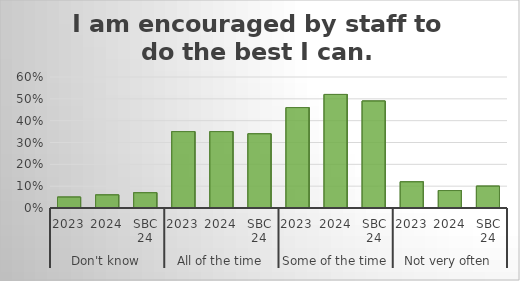
| Category | I am encouraged by staff to do the best I can. |
|---|---|
| 0 | 0.05 |
| 1 | 0.06 |
| 2 | 0.07 |
| 3 | 0.35 |
| 4 | 0.35 |
| 5 | 0.34 |
| 6 | 0.46 |
| 7 | 0.52 |
| 8 | 0.49 |
| 9 | 0.12 |
| 10 | 0.08 |
| 11 | 0.1 |